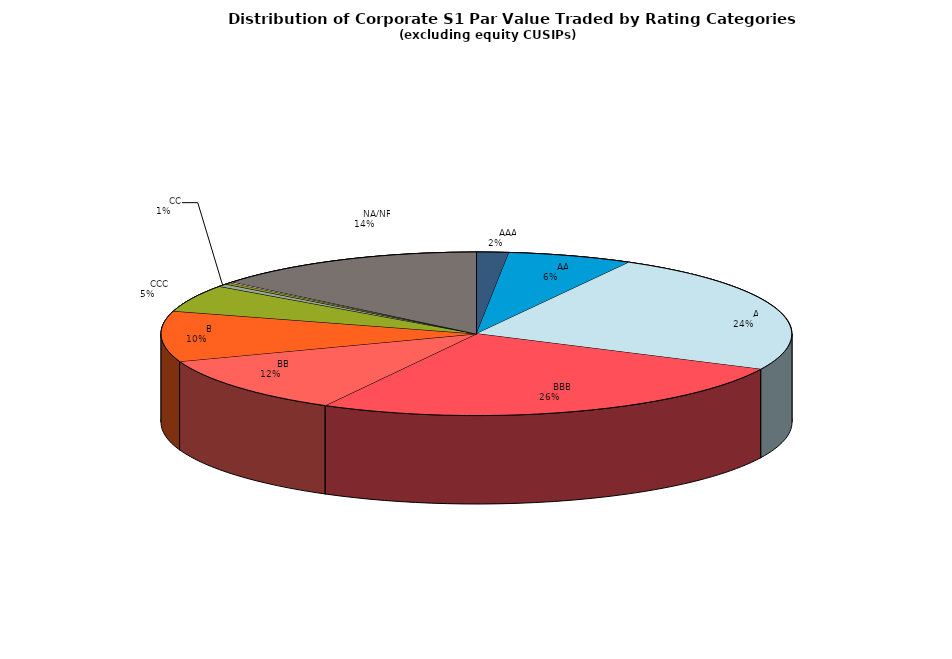
| Category | Series 0 |
|---|---|
|         AAA | 429668894.276 |
|         AA | 1670619496.091 |
|         A | 6291788449.81 |
|         BBB | 6733061780.245 |
|         BB | 3015938316.119 |
|         B | 2601762177.403 |
|         CCC | 1399719053.153 |
|         CC | 142225979.174 |
|         C | 94487098.199 |
|         D | 46587906.773 |
|         NA/NR | 3671595148.574 |